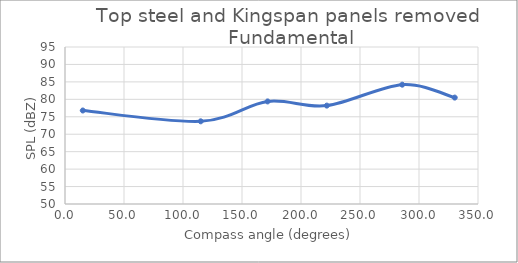
| Category | Series 0 |
|---|---|
| 15.06445125542554 | 76.8 |
| 115.00449447818254 | 73.7 |
| 171.7068171198818 | 79.4 |
| 221.8691292075067 | 78.2 |
| 285.7828166838848 | 84.2 |
| 330.28010595813004 | 80.5 |